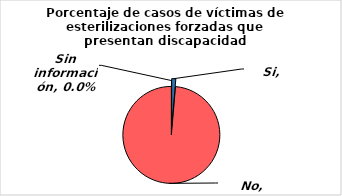
| Category | Series 0 |
|---|---|
| Si | 0.014 |
| No | 0.986 |
| Sin información | 0 |